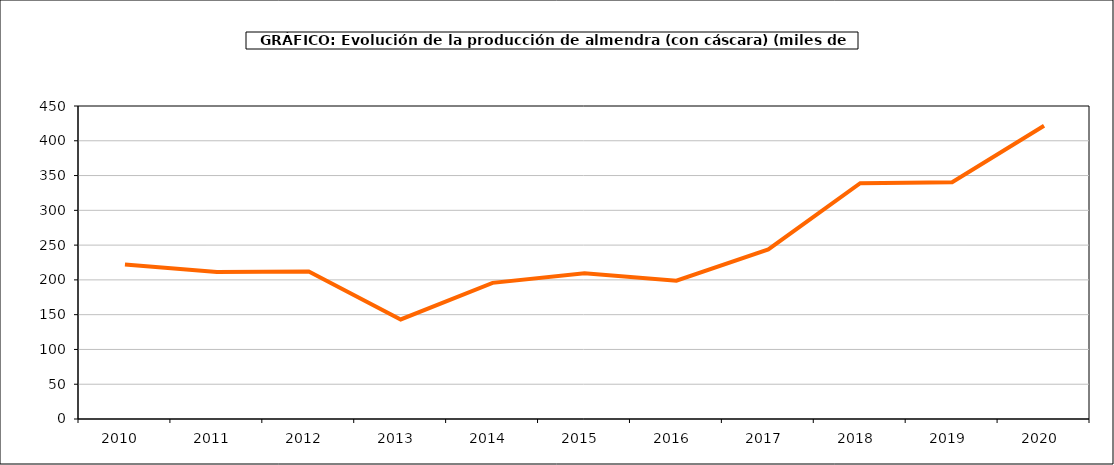
| Category | producción almendro |
|---|---|
| 2010.0 | 222.217 |
| 2011.0 | 211.179 |
| 2012.0 | 212.063 |
| 2013.0 | 143.081 |
| 2014.0 | 195.699 |
| 2015.0 | 209.443 |
| 2016.0 | 198.767 |
| 2017.0 | 243.876 |
| 2018.0 | 339.033 |
| 2019.0 | 340.421 |
| 2020.0 | 421.61 |